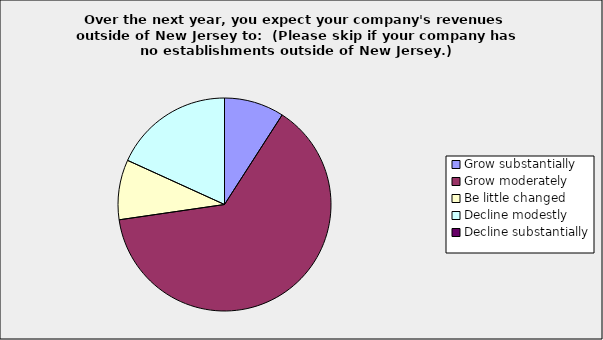
| Category | Series 0 |
|---|---|
| Grow substantially | 0.091 |
| Grow moderately | 0.636 |
| Be little changed | 0.091 |
| Decline modestly | 0.182 |
| Decline substantially | 0 |